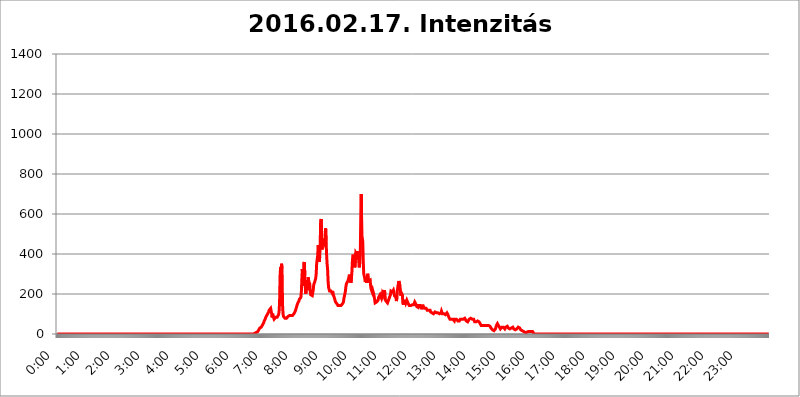
| Category | 2016.02.17. Intenzitás [W/m^2] |
|---|---|
| 0.0 | 0 |
| 0.0006944444444444445 | 0 |
| 0.001388888888888889 | 0 |
| 0.0020833333333333333 | 0 |
| 0.002777777777777778 | 0 |
| 0.003472222222222222 | 0 |
| 0.004166666666666667 | 0 |
| 0.004861111111111111 | 0 |
| 0.005555555555555556 | 0 |
| 0.0062499999999999995 | 0 |
| 0.006944444444444444 | 0 |
| 0.007638888888888889 | 0 |
| 0.008333333333333333 | 0 |
| 0.009027777777777779 | 0 |
| 0.009722222222222222 | 0 |
| 0.010416666666666666 | 0 |
| 0.011111111111111112 | 0 |
| 0.011805555555555555 | 0 |
| 0.012499999999999999 | 0 |
| 0.013194444444444444 | 0 |
| 0.013888888888888888 | 0 |
| 0.014583333333333332 | 0 |
| 0.015277777777777777 | 0 |
| 0.015972222222222224 | 0 |
| 0.016666666666666666 | 0 |
| 0.017361111111111112 | 0 |
| 0.018055555555555557 | 0 |
| 0.01875 | 0 |
| 0.019444444444444445 | 0 |
| 0.02013888888888889 | 0 |
| 0.020833333333333332 | 0 |
| 0.02152777777777778 | 0 |
| 0.022222222222222223 | 0 |
| 0.02291666666666667 | 0 |
| 0.02361111111111111 | 0 |
| 0.024305555555555556 | 0 |
| 0.024999999999999998 | 0 |
| 0.025694444444444447 | 0 |
| 0.02638888888888889 | 0 |
| 0.027083333333333334 | 0 |
| 0.027777777777777776 | 0 |
| 0.02847222222222222 | 0 |
| 0.029166666666666664 | 0 |
| 0.029861111111111113 | 0 |
| 0.030555555555555555 | 0 |
| 0.03125 | 0 |
| 0.03194444444444445 | 0 |
| 0.03263888888888889 | 0 |
| 0.03333333333333333 | 0 |
| 0.034027777777777775 | 0 |
| 0.034722222222222224 | 0 |
| 0.035416666666666666 | 0 |
| 0.036111111111111115 | 0 |
| 0.03680555555555556 | 0 |
| 0.0375 | 0 |
| 0.03819444444444444 | 0 |
| 0.03888888888888889 | 0 |
| 0.03958333333333333 | 0 |
| 0.04027777777777778 | 0 |
| 0.04097222222222222 | 0 |
| 0.041666666666666664 | 0 |
| 0.042361111111111106 | 0 |
| 0.04305555555555556 | 0 |
| 0.043750000000000004 | 0 |
| 0.044444444444444446 | 0 |
| 0.04513888888888889 | 0 |
| 0.04583333333333334 | 0 |
| 0.04652777777777778 | 0 |
| 0.04722222222222222 | 0 |
| 0.04791666666666666 | 0 |
| 0.04861111111111111 | 0 |
| 0.049305555555555554 | 0 |
| 0.049999999999999996 | 0 |
| 0.05069444444444445 | 0 |
| 0.051388888888888894 | 0 |
| 0.052083333333333336 | 0 |
| 0.05277777777777778 | 0 |
| 0.05347222222222222 | 0 |
| 0.05416666666666667 | 0 |
| 0.05486111111111111 | 0 |
| 0.05555555555555555 | 0 |
| 0.05625 | 0 |
| 0.05694444444444444 | 0 |
| 0.057638888888888885 | 0 |
| 0.05833333333333333 | 0 |
| 0.05902777777777778 | 0 |
| 0.059722222222222225 | 0 |
| 0.06041666666666667 | 0 |
| 0.061111111111111116 | 0 |
| 0.06180555555555556 | 0 |
| 0.0625 | 0 |
| 0.06319444444444444 | 0 |
| 0.06388888888888888 | 0 |
| 0.06458333333333334 | 0 |
| 0.06527777777777778 | 0 |
| 0.06597222222222222 | 0 |
| 0.06666666666666667 | 0 |
| 0.06736111111111111 | 0 |
| 0.06805555555555555 | 0 |
| 0.06874999999999999 | 0 |
| 0.06944444444444443 | 0 |
| 0.07013888888888889 | 0 |
| 0.07083333333333333 | 0 |
| 0.07152777777777779 | 0 |
| 0.07222222222222223 | 0 |
| 0.07291666666666667 | 0 |
| 0.07361111111111111 | 0 |
| 0.07430555555555556 | 0 |
| 0.075 | 0 |
| 0.07569444444444444 | 0 |
| 0.0763888888888889 | 0 |
| 0.07708333333333334 | 0 |
| 0.07777777777777778 | 0 |
| 0.07847222222222222 | 0 |
| 0.07916666666666666 | 0 |
| 0.0798611111111111 | 0 |
| 0.08055555555555556 | 0 |
| 0.08125 | 0 |
| 0.08194444444444444 | 0 |
| 0.08263888888888889 | 0 |
| 0.08333333333333333 | 0 |
| 0.08402777777777777 | 0 |
| 0.08472222222222221 | 0 |
| 0.08541666666666665 | 0 |
| 0.08611111111111112 | 0 |
| 0.08680555555555557 | 0 |
| 0.08750000000000001 | 0 |
| 0.08819444444444445 | 0 |
| 0.08888888888888889 | 0 |
| 0.08958333333333333 | 0 |
| 0.09027777777777778 | 0 |
| 0.09097222222222222 | 0 |
| 0.09166666666666667 | 0 |
| 0.09236111111111112 | 0 |
| 0.09305555555555556 | 0 |
| 0.09375 | 0 |
| 0.09444444444444444 | 0 |
| 0.09513888888888888 | 0 |
| 0.09583333333333333 | 0 |
| 0.09652777777777777 | 0 |
| 0.09722222222222222 | 0 |
| 0.09791666666666667 | 0 |
| 0.09861111111111111 | 0 |
| 0.09930555555555555 | 0 |
| 0.09999999999999999 | 0 |
| 0.10069444444444443 | 0 |
| 0.1013888888888889 | 0 |
| 0.10208333333333335 | 0 |
| 0.10277777777777779 | 0 |
| 0.10347222222222223 | 0 |
| 0.10416666666666667 | 0 |
| 0.10486111111111111 | 0 |
| 0.10555555555555556 | 0 |
| 0.10625 | 0 |
| 0.10694444444444444 | 0 |
| 0.1076388888888889 | 0 |
| 0.10833333333333334 | 0 |
| 0.10902777777777778 | 0 |
| 0.10972222222222222 | 0 |
| 0.1111111111111111 | 0 |
| 0.11180555555555556 | 0 |
| 0.11180555555555556 | 0 |
| 0.1125 | 0 |
| 0.11319444444444444 | 0 |
| 0.11388888888888889 | 0 |
| 0.11458333333333333 | 0 |
| 0.11527777777777777 | 0 |
| 0.11597222222222221 | 0 |
| 0.11666666666666665 | 0 |
| 0.1173611111111111 | 0 |
| 0.11805555555555557 | 0 |
| 0.11944444444444445 | 0 |
| 0.12013888888888889 | 0 |
| 0.12083333333333333 | 0 |
| 0.12152777777777778 | 0 |
| 0.12222222222222223 | 0 |
| 0.12291666666666667 | 0 |
| 0.12291666666666667 | 0 |
| 0.12361111111111112 | 0 |
| 0.12430555555555556 | 0 |
| 0.125 | 0 |
| 0.12569444444444444 | 0 |
| 0.12638888888888888 | 0 |
| 0.12708333333333333 | 0 |
| 0.16875 | 0 |
| 0.12847222222222224 | 0 |
| 0.12916666666666668 | 0 |
| 0.12986111111111112 | 0 |
| 0.13055555555555556 | 0 |
| 0.13125 | 0 |
| 0.13194444444444445 | 0 |
| 0.1326388888888889 | 0 |
| 0.13333333333333333 | 0 |
| 0.13402777777777777 | 0 |
| 0.13402777777777777 | 0 |
| 0.13472222222222222 | 0 |
| 0.13541666666666666 | 0 |
| 0.1361111111111111 | 0 |
| 0.13749999999999998 | 0 |
| 0.13819444444444443 | 0 |
| 0.1388888888888889 | 0 |
| 0.13958333333333334 | 0 |
| 0.14027777777777778 | 0 |
| 0.14097222222222222 | 0 |
| 0.14166666666666666 | 0 |
| 0.1423611111111111 | 0 |
| 0.14305555555555557 | 0 |
| 0.14375000000000002 | 0 |
| 0.14444444444444446 | 0 |
| 0.1451388888888889 | 0 |
| 0.1451388888888889 | 0 |
| 0.14652777777777778 | 0 |
| 0.14722222222222223 | 0 |
| 0.14791666666666667 | 0 |
| 0.1486111111111111 | 0 |
| 0.14930555555555555 | 0 |
| 0.15 | 0 |
| 0.15069444444444444 | 0 |
| 0.15138888888888888 | 0 |
| 0.15208333333333332 | 0 |
| 0.15277777777777776 | 0 |
| 0.15347222222222223 | 0 |
| 0.15416666666666667 | 0 |
| 0.15486111111111112 | 0 |
| 0.15555555555555556 | 0 |
| 0.15625 | 0 |
| 0.15694444444444444 | 0 |
| 0.15763888888888888 | 0 |
| 0.15833333333333333 | 0 |
| 0.15902777777777777 | 0 |
| 0.15972222222222224 | 0 |
| 0.16041666666666668 | 0 |
| 0.16111111111111112 | 0 |
| 0.16180555555555556 | 0 |
| 0.1625 | 0 |
| 0.16319444444444445 | 0 |
| 0.1638888888888889 | 0 |
| 0.16458333333333333 | 0 |
| 0.16527777777777777 | 0 |
| 0.16597222222222222 | 0 |
| 0.16666666666666666 | 0 |
| 0.1673611111111111 | 0 |
| 0.16805555555555554 | 0 |
| 0.16874999999999998 | 0 |
| 0.16944444444444443 | 0 |
| 0.17013888888888887 | 0 |
| 0.1708333333333333 | 0 |
| 0.17152777777777775 | 0 |
| 0.17222222222222225 | 0 |
| 0.1729166666666667 | 0 |
| 0.17361111111111113 | 0 |
| 0.17430555555555557 | 0 |
| 0.17500000000000002 | 0 |
| 0.17569444444444446 | 0 |
| 0.1763888888888889 | 0 |
| 0.17708333333333334 | 0 |
| 0.17777777777777778 | 0 |
| 0.17847222222222223 | 0 |
| 0.17916666666666667 | 0 |
| 0.1798611111111111 | 0 |
| 0.18055555555555555 | 0 |
| 0.18125 | 0 |
| 0.18194444444444444 | 0 |
| 0.1826388888888889 | 0 |
| 0.18333333333333335 | 0 |
| 0.1840277777777778 | 0 |
| 0.18472222222222223 | 0 |
| 0.18541666666666667 | 0 |
| 0.18611111111111112 | 0 |
| 0.18680555555555556 | 0 |
| 0.1875 | 0 |
| 0.18819444444444444 | 0 |
| 0.18888888888888888 | 0 |
| 0.18958333333333333 | 0 |
| 0.19027777777777777 | 0 |
| 0.1909722222222222 | 0 |
| 0.19166666666666665 | 0 |
| 0.19236111111111112 | 0 |
| 0.19305555555555554 | 0 |
| 0.19375 | 0 |
| 0.19444444444444445 | 0 |
| 0.1951388888888889 | 0 |
| 0.19583333333333333 | 0 |
| 0.19652777777777777 | 0 |
| 0.19722222222222222 | 0 |
| 0.19791666666666666 | 0 |
| 0.1986111111111111 | 0 |
| 0.19930555555555554 | 0 |
| 0.19999999999999998 | 0 |
| 0.20069444444444443 | 0 |
| 0.20138888888888887 | 0 |
| 0.2020833333333333 | 0 |
| 0.2027777777777778 | 0 |
| 0.2034722222222222 | 0 |
| 0.2041666666666667 | 0 |
| 0.20486111111111113 | 0 |
| 0.20555555555555557 | 0 |
| 0.20625000000000002 | 0 |
| 0.20694444444444446 | 0 |
| 0.2076388888888889 | 0 |
| 0.20833333333333334 | 0 |
| 0.20902777777777778 | 0 |
| 0.20972222222222223 | 0 |
| 0.21041666666666667 | 0 |
| 0.2111111111111111 | 0 |
| 0.21180555555555555 | 0 |
| 0.2125 | 0 |
| 0.21319444444444444 | 0 |
| 0.2138888888888889 | 0 |
| 0.21458333333333335 | 0 |
| 0.2152777777777778 | 0 |
| 0.21597222222222223 | 0 |
| 0.21666666666666667 | 0 |
| 0.21736111111111112 | 0 |
| 0.21805555555555556 | 0 |
| 0.21875 | 0 |
| 0.21944444444444444 | 0 |
| 0.22013888888888888 | 0 |
| 0.22083333333333333 | 0 |
| 0.22152777777777777 | 0 |
| 0.2222222222222222 | 0 |
| 0.22291666666666665 | 0 |
| 0.2236111111111111 | 0 |
| 0.22430555555555556 | 0 |
| 0.225 | 0 |
| 0.22569444444444445 | 0 |
| 0.2263888888888889 | 0 |
| 0.22708333333333333 | 0 |
| 0.22777777777777777 | 0 |
| 0.22847222222222222 | 0 |
| 0.22916666666666666 | 0 |
| 0.2298611111111111 | 0 |
| 0.23055555555555554 | 0 |
| 0.23124999999999998 | 0 |
| 0.23194444444444443 | 0 |
| 0.23263888888888887 | 0 |
| 0.2333333333333333 | 0 |
| 0.2340277777777778 | 0 |
| 0.2347222222222222 | 0 |
| 0.2354166666666667 | 0 |
| 0.23611111111111113 | 0 |
| 0.23680555555555557 | 0 |
| 0.23750000000000002 | 0 |
| 0.23819444444444446 | 0 |
| 0.2388888888888889 | 0 |
| 0.23958333333333334 | 0 |
| 0.24027777777777778 | 0 |
| 0.24097222222222223 | 0 |
| 0.24166666666666667 | 0 |
| 0.2423611111111111 | 0 |
| 0.24305555555555555 | 0 |
| 0.24375 | 0 |
| 0.24444444444444446 | 0 |
| 0.24513888888888888 | 0 |
| 0.24583333333333335 | 0 |
| 0.2465277777777778 | 0 |
| 0.24722222222222223 | 0 |
| 0.24791666666666667 | 0 |
| 0.24861111111111112 | 0 |
| 0.24930555555555556 | 0 |
| 0.25 | 0 |
| 0.25069444444444444 | 0 |
| 0.2513888888888889 | 0 |
| 0.2520833333333333 | 0 |
| 0.25277777777777777 | 0 |
| 0.2534722222222222 | 0 |
| 0.25416666666666665 | 0 |
| 0.2548611111111111 | 0 |
| 0.2555555555555556 | 0 |
| 0.25625000000000003 | 0 |
| 0.2569444444444445 | 0 |
| 0.2576388888888889 | 0 |
| 0.25833333333333336 | 0 |
| 0.2590277777777778 | 0 |
| 0.25972222222222224 | 0 |
| 0.2604166666666667 | 0 |
| 0.2611111111111111 | 0 |
| 0.26180555555555557 | 0 |
| 0.2625 | 0 |
| 0.26319444444444445 | 0 |
| 0.2638888888888889 | 0 |
| 0.26458333333333334 | 0 |
| 0.2652777777777778 | 0 |
| 0.2659722222222222 | 0 |
| 0.26666666666666666 | 0 |
| 0.2673611111111111 | 0 |
| 0.26805555555555555 | 0 |
| 0.26875 | 0 |
| 0.26944444444444443 | 0 |
| 0.2701388888888889 | 0 |
| 0.2708333333333333 | 0 |
| 0.27152777777777776 | 0 |
| 0.2722222222222222 | 0 |
| 0.27291666666666664 | 0 |
| 0.2736111111111111 | 0 |
| 0.2743055555555555 | 0 |
| 0.27499999999999997 | 0 |
| 0.27569444444444446 | 3.525 |
| 0.27638888888888885 | 3.525 |
| 0.27708333333333335 | 3.525 |
| 0.2777777777777778 | 3.525 |
| 0.27847222222222223 | 7.887 |
| 0.2791666666666667 | 7.887 |
| 0.2798611111111111 | 12.257 |
| 0.28055555555555556 | 12.257 |
| 0.28125 | 12.257 |
| 0.28194444444444444 | 16.636 |
| 0.2826388888888889 | 21.024 |
| 0.2833333333333333 | 25.419 |
| 0.28402777777777777 | 29.823 |
| 0.2847222222222222 | 29.823 |
| 0.28541666666666665 | 34.234 |
| 0.28611111111111115 | 34.234 |
| 0.28680555555555554 | 38.653 |
| 0.28750000000000003 | 43.079 |
| 0.2881944444444445 | 47.511 |
| 0.2888888888888889 | 47.511 |
| 0.28958333333333336 | 56.398 |
| 0.2902777777777778 | 65.31 |
| 0.29097222222222224 | 69.775 |
| 0.2916666666666667 | 74.246 |
| 0.2923611111111111 | 83.205 |
| 0.29305555555555557 | 83.205 |
| 0.29375 | 92.184 |
| 0.29444444444444445 | 92.184 |
| 0.2951388888888889 | 101.184 |
| 0.29583333333333334 | 101.184 |
| 0.2965277777777778 | 110.201 |
| 0.2972222222222222 | 119.235 |
| 0.29791666666666666 | 123.758 |
| 0.2986111111111111 | 123.758 |
| 0.29930555555555555 | 128.284 |
| 0.3 | 123.758 |
| 0.30069444444444443 | 101.184 |
| 0.3013888888888889 | 83.205 |
| 0.3020833333333333 | 101.184 |
| 0.30277777777777776 | 87.692 |
| 0.3034722222222222 | 83.205 |
| 0.30416666666666664 | 74.246 |
| 0.3048611111111111 | 78.722 |
| 0.3055555555555555 | 78.722 |
| 0.30624999999999997 | 83.205 |
| 0.3069444444444444 | 83.205 |
| 0.3076388888888889 | 83.205 |
| 0.30833333333333335 | 83.205 |
| 0.3090277777777778 | 83.205 |
| 0.30972222222222223 | 87.692 |
| 0.3104166666666667 | 96.682 |
| 0.3111111111111111 | 110.201 |
| 0.31180555555555556 | 155.509 |
| 0.3125 | 287.709 |
| 0.31319444444444444 | 333.113 |
| 0.3138888888888889 | 310.44 |
| 0.3145833333333333 | 351.198 |
| 0.31527777777777777 | 328.584 |
| 0.3159722222222222 | 146.423 |
| 0.31666666666666665 | 101.184 |
| 0.31736111111111115 | 87.692 |
| 0.31805555555555554 | 83.205 |
| 0.31875000000000003 | 83.205 |
| 0.3194444444444445 | 78.722 |
| 0.3201388888888889 | 78.722 |
| 0.32083333333333336 | 78.722 |
| 0.3215277777777778 | 78.722 |
| 0.32222222222222224 | 78.722 |
| 0.3229166666666667 | 83.205 |
| 0.3236111111111111 | 87.692 |
| 0.32430555555555557 | 87.692 |
| 0.325 | 92.184 |
| 0.32569444444444445 | 92.184 |
| 0.3263888888888889 | 92.184 |
| 0.32708333333333334 | 92.184 |
| 0.3277777777777778 | 92.184 |
| 0.3284722222222222 | 92.184 |
| 0.32916666666666666 | 87.692 |
| 0.3298611111111111 | 92.184 |
| 0.33055555555555555 | 92.184 |
| 0.33125 | 92.184 |
| 0.33194444444444443 | 101.184 |
| 0.3326388888888889 | 105.69 |
| 0.3333333333333333 | 110.201 |
| 0.3340277777777778 | 114.716 |
| 0.3347222222222222 | 123.758 |
| 0.3354166666666667 | 132.814 |
| 0.3361111111111111 | 141.884 |
| 0.3368055555555556 | 146.423 |
| 0.33749999999999997 | 155.509 |
| 0.33819444444444446 | 160.056 |
| 0.33888888888888885 | 164.605 |
| 0.33958333333333335 | 173.709 |
| 0.34027777777777773 | 173.709 |
| 0.34097222222222223 | 173.709 |
| 0.3416666666666666 | 182.82 |
| 0.3423611111111111 | 210.182 |
| 0.3430555555555555 | 274.047 |
| 0.34375 | 324.052 |
| 0.3444444444444445 | 242.127 |
| 0.3451388888888889 | 269.49 |
| 0.3458333333333334 | 351.198 |
| 0.34652777777777777 | 360.221 |
| 0.34722222222222227 | 292.259 |
| 0.34791666666666665 | 233 |
| 0.34861111111111115 | 201.058 |
| 0.34930555555555554 | 201.058 |
| 0.35000000000000003 | 269.49 |
| 0.3506944444444444 | 219.309 |
| 0.3513888888888889 | 228.436 |
| 0.3520833333333333 | 283.156 |
| 0.3527777777777778 | 260.373 |
| 0.3534722222222222 | 255.813 |
| 0.3541666666666667 | 251.251 |
| 0.3548611111111111 | 210.182 |
| 0.35555555555555557 | 196.497 |
| 0.35625 | 201.058 |
| 0.35694444444444445 | 191.937 |
| 0.3576388888888889 | 191.937 |
| 0.35833333333333334 | 196.497 |
| 0.3590277777777778 | 219.309 |
| 0.3597222222222222 | 246.689 |
| 0.36041666666666666 | 246.689 |
| 0.3611111111111111 | 260.373 |
| 0.36180555555555555 | 264.932 |
| 0.3625 | 278.603 |
| 0.36319444444444443 | 301.354 |
| 0.3638888888888889 | 355.712 |
| 0.3645833333333333 | 373.729 |
| 0.3652777777777778 | 391.685 |
| 0.3659722222222222 | 445.129 |
| 0.3666666666666667 | 431.833 |
| 0.3673611111111111 | 360.221 |
| 0.3680555555555556 | 382.715 |
| 0.36874999999999997 | 440.702 |
| 0.36944444444444446 | 562.53 |
| 0.37013888888888885 | 575.299 |
| 0.37083333333333335 | 510.885 |
| 0.37152777777777773 | 422.943 |
| 0.37222222222222223 | 475.972 |
| 0.3729166666666666 | 467.187 |
| 0.3736111111111111 | 462.786 |
| 0.3743055555555555 | 453.968 |
| 0.375 | 458.38 |
| 0.3756944444444445 | 471.582 |
| 0.3763888888888889 | 528.2 |
| 0.3770833333333334 | 462.786 |
| 0.37777777777777777 | 396.164 |
| 0.37847222222222227 | 351.198 |
| 0.37916666666666665 | 324.052 |
| 0.37986111111111115 | 264.932 |
| 0.38055555555555554 | 233 |
| 0.38125000000000003 | 223.873 |
| 0.3819444444444444 | 214.746 |
| 0.3826388888888889 | 219.309 |
| 0.3833333333333333 | 210.182 |
| 0.3840277777777778 | 214.746 |
| 0.3847222222222222 | 210.182 |
| 0.3854166666666667 | 205.62 |
| 0.3861111111111111 | 214.746 |
| 0.38680555555555557 | 201.058 |
| 0.3875 | 201.058 |
| 0.38819444444444445 | 196.497 |
| 0.3888888888888889 | 178.264 |
| 0.38958333333333334 | 169.156 |
| 0.3902777777777778 | 160.056 |
| 0.3909722222222222 | 160.056 |
| 0.39166666666666666 | 155.509 |
| 0.3923611111111111 | 150.964 |
| 0.39305555555555555 | 150.964 |
| 0.39375 | 141.884 |
| 0.39444444444444443 | 146.423 |
| 0.3951388888888889 | 141.884 |
| 0.3958333333333333 | 141.884 |
| 0.3965277777777778 | 141.884 |
| 0.3972222222222222 | 141.884 |
| 0.3979166666666667 | 141.884 |
| 0.3986111111111111 | 137.347 |
| 0.3993055555555556 | 141.884 |
| 0.39999999999999997 | 150.964 |
| 0.40069444444444446 | 155.509 |
| 0.40138888888888885 | 160.056 |
| 0.40208333333333335 | 178.264 |
| 0.40277777777777773 | 182.82 |
| 0.40347222222222223 | 201.058 |
| 0.4041666666666666 | 214.746 |
| 0.4048611111111111 | 237.564 |
| 0.4055555555555555 | 251.251 |
| 0.40625 | 251.251 |
| 0.4069444444444445 | 255.813 |
| 0.4076388888888889 | 264.932 |
| 0.4083333333333334 | 269.49 |
| 0.40902777777777777 | 283.156 |
| 0.40972222222222227 | 296.808 |
| 0.41041666666666665 | 283.156 |
| 0.41111111111111115 | 274.047 |
| 0.41180555555555554 | 255.813 |
| 0.41250000000000003 | 274.047 |
| 0.4131944444444444 | 305.898 |
| 0.4138888888888889 | 360.221 |
| 0.4145833333333333 | 391.685 |
| 0.4152777777777778 | 396.164 |
| 0.4159722222222222 | 387.202 |
| 0.4166666666666667 | 391.685 |
| 0.4173611111111111 | 333.113 |
| 0.41805555555555557 | 333.113 |
| 0.41875 | 405.108 |
| 0.41944444444444445 | 400.638 |
| 0.4201388888888889 | 400.638 |
| 0.42083333333333334 | 391.685 |
| 0.4215277777777778 | 414.035 |
| 0.4222222222222222 | 396.164 |
| 0.42291666666666666 | 360.221 |
| 0.4236111111111111 | 333.113 |
| 0.42430555555555555 | 360.221 |
| 0.425 | 391.685 |
| 0.42569444444444443 | 588.009 |
| 0.4263888888888889 | 699.717 |
| 0.4270833333333333 | 497.836 |
| 0.4277777777777778 | 493.475 |
| 0.4284722222222222 | 462.786 |
| 0.4291666666666667 | 364.728 |
| 0.4298611111111111 | 301.354 |
| 0.4305555555555556 | 305.898 |
| 0.43124999999999997 | 278.603 |
| 0.43194444444444446 | 260.373 |
| 0.43263888888888885 | 264.932 |
| 0.43333333333333335 | 274.047 |
| 0.43402777777777773 | 255.813 |
| 0.43472222222222223 | 274.047 |
| 0.4354166666666666 | 301.354 |
| 0.4361111111111111 | 274.047 |
| 0.4368055555555555 | 264.932 |
| 0.4375 | 260.373 |
| 0.4381944444444445 | 264.932 |
| 0.4388888888888889 | 269.49 |
| 0.4395833333333334 | 237.564 |
| 0.44027777777777777 | 223.873 |
| 0.44097222222222227 | 219.309 |
| 0.44166666666666665 | 210.182 |
| 0.44236111111111115 | 219.309 |
| 0.44305555555555554 | 210.182 |
| 0.44375000000000003 | 201.058 |
| 0.4444444444444444 | 187.378 |
| 0.4451388888888889 | 173.709 |
| 0.4458333333333333 | 155.509 |
| 0.4465277777777778 | 150.964 |
| 0.4472222222222222 | 150.964 |
| 0.4479166666666667 | 160.056 |
| 0.4486111111111111 | 164.605 |
| 0.44930555555555557 | 164.605 |
| 0.45 | 169.156 |
| 0.45069444444444445 | 182.82 |
| 0.4513888888888889 | 187.378 |
| 0.45208333333333334 | 187.378 |
| 0.4527777777777778 | 196.497 |
| 0.4534722222222222 | 196.497 |
| 0.45416666666666666 | 196.497 |
| 0.4548611111111111 | 178.264 |
| 0.45555555555555555 | 187.378 |
| 0.45625 | 205.62 |
| 0.45694444444444443 | 205.62 |
| 0.4576388888888889 | 196.497 |
| 0.4583333333333333 | 210.182 |
| 0.4590277777777778 | 219.309 |
| 0.4597222222222222 | 173.709 |
| 0.4604166666666667 | 169.156 |
| 0.4611111111111111 | 164.605 |
| 0.4618055555555556 | 164.605 |
| 0.46249999999999997 | 160.056 |
| 0.46319444444444446 | 155.509 |
| 0.46388888888888885 | 155.509 |
| 0.46458333333333335 | 169.156 |
| 0.46527777777777773 | 173.709 |
| 0.46597222222222223 | 182.82 |
| 0.4666666666666666 | 182.82 |
| 0.4673611111111111 | 196.497 |
| 0.4680555555555555 | 214.746 |
| 0.46875 | 214.746 |
| 0.4694444444444445 | 214.746 |
| 0.4701388888888889 | 210.182 |
| 0.4708333333333334 | 214.746 |
| 0.47152777777777777 | 219.309 |
| 0.47222222222222227 | 210.182 |
| 0.47291666666666665 | 191.937 |
| 0.47361111111111115 | 196.497 |
| 0.47430555555555554 | 196.497 |
| 0.47500000000000003 | 182.82 |
| 0.4756944444444444 | 164.605 |
| 0.4763888888888889 | 182.82 |
| 0.4770833333333333 | 219.309 |
| 0.4777777777777778 | 237.564 |
| 0.4784722222222222 | 251.251 |
| 0.4791666666666667 | 264.932 |
| 0.4798611111111111 | 264.932 |
| 0.48055555555555557 | 242.127 |
| 0.48125 | 219.309 |
| 0.48194444444444445 | 191.937 |
| 0.4826388888888889 | 205.62 |
| 0.48333333333333334 | 205.62 |
| 0.4840277777777778 | 196.497 |
| 0.4847222222222222 | 155.509 |
| 0.48541666666666666 | 146.423 |
| 0.4861111111111111 | 164.605 |
| 0.48680555555555555 | 160.056 |
| 0.4875 | 164.605 |
| 0.48819444444444443 | 164.605 |
| 0.4888888888888889 | 155.509 |
| 0.4895833333333333 | 160.056 |
| 0.4902777777777778 | 169.156 |
| 0.4909722222222222 | 173.709 |
| 0.4916666666666667 | 169.156 |
| 0.4923611111111111 | 150.964 |
| 0.4930555555555556 | 146.423 |
| 0.49374999999999997 | 141.884 |
| 0.49444444444444446 | 141.884 |
| 0.49513888888888885 | 141.884 |
| 0.49583333333333335 | 141.884 |
| 0.49652777777777773 | 141.884 |
| 0.49722222222222223 | 146.423 |
| 0.4979166666666666 | 146.423 |
| 0.4986111111111111 | 150.964 |
| 0.4993055555555555 | 150.964 |
| 0.5 | 146.423 |
| 0.5006944444444444 | 150.964 |
| 0.5013888888888889 | 160.056 |
| 0.5020833333333333 | 160.056 |
| 0.5027777777777778 | 150.964 |
| 0.5034722222222222 | 146.423 |
| 0.5041666666666667 | 137.347 |
| 0.5048611111111111 | 141.884 |
| 0.5055555555555555 | 141.884 |
| 0.50625 | 132.814 |
| 0.5069444444444444 | 141.884 |
| 0.5076388888888889 | 137.347 |
| 0.5083333333333333 | 137.347 |
| 0.5090277777777777 | 141.884 |
| 0.5097222222222222 | 141.884 |
| 0.5104166666666666 | 132.814 |
| 0.5111111111111112 | 123.758 |
| 0.5118055555555555 | 128.284 |
| 0.5125000000000001 | 146.423 |
| 0.5131944444444444 | 137.347 |
| 0.513888888888889 | 137.347 |
| 0.5145833333333333 | 132.814 |
| 0.5152777777777778 | 128.284 |
| 0.5159722222222222 | 132.814 |
| 0.5166666666666667 | 123.758 |
| 0.517361111111111 | 128.284 |
| 0.5180555555555556 | 123.758 |
| 0.5187499999999999 | 119.235 |
| 0.5194444444444445 | 119.235 |
| 0.5201388888888888 | 119.235 |
| 0.5208333333333334 | 119.235 |
| 0.5215277777777778 | 119.235 |
| 0.5222222222222223 | 119.235 |
| 0.5229166666666667 | 119.235 |
| 0.5236111111111111 | 110.201 |
| 0.5243055555555556 | 110.201 |
| 0.525 | 105.69 |
| 0.5256944444444445 | 105.69 |
| 0.5263888888888889 | 105.69 |
| 0.5270833333333333 | 105.69 |
| 0.5277777777777778 | 101.184 |
| 0.5284722222222222 | 105.69 |
| 0.5291666666666667 | 105.69 |
| 0.5298611111111111 | 110.201 |
| 0.5305555555555556 | 110.201 |
| 0.53125 | 110.201 |
| 0.5319444444444444 | 105.69 |
| 0.5326388888888889 | 105.69 |
| 0.5333333333333333 | 105.69 |
| 0.5340277777777778 | 105.69 |
| 0.5347222222222222 | 101.184 |
| 0.5354166666666667 | 101.184 |
| 0.5361111111111111 | 101.184 |
| 0.5368055555555555 | 105.69 |
| 0.5375 | 101.184 |
| 0.5381944444444444 | 105.69 |
| 0.5388888888888889 | 114.716 |
| 0.5395833333333333 | 114.716 |
| 0.5402777777777777 | 101.184 |
| 0.5409722222222222 | 105.69 |
| 0.5416666666666666 | 105.69 |
| 0.5423611111111112 | 101.184 |
| 0.5430555555555555 | 96.682 |
| 0.5437500000000001 | 96.682 |
| 0.5444444444444444 | 96.682 |
| 0.545138888888889 | 101.184 |
| 0.5458333333333333 | 101.184 |
| 0.5465277777777778 | 105.69 |
| 0.5472222222222222 | 101.184 |
| 0.5479166666666667 | 96.682 |
| 0.548611111111111 | 92.184 |
| 0.5493055555555556 | 83.205 |
| 0.5499999999999999 | 78.722 |
| 0.5506944444444445 | 74.246 |
| 0.5513888888888888 | 74.246 |
| 0.5520833333333334 | 78.722 |
| 0.5527777777777778 | 74.246 |
| 0.5534722222222223 | 78.722 |
| 0.5541666666666667 | 74.246 |
| 0.5548611111111111 | 74.246 |
| 0.5555555555555556 | 74.246 |
| 0.55625 | 78.722 |
| 0.5569444444444445 | 65.31 |
| 0.5576388888888889 | 74.246 |
| 0.5583333333333333 | 74.246 |
| 0.5590277777777778 | 74.246 |
| 0.5597222222222222 | 74.246 |
| 0.5604166666666667 | 74.246 |
| 0.5611111111111111 | 69.775 |
| 0.5618055555555556 | 65.31 |
| 0.5625 | 65.31 |
| 0.5631944444444444 | 65.31 |
| 0.5638888888888889 | 65.31 |
| 0.5645833333333333 | 69.775 |
| 0.5652777777777778 | 74.246 |
| 0.5659722222222222 | 78.722 |
| 0.5666666666666667 | 74.246 |
| 0.5673611111111111 | 74.246 |
| 0.5680555555555555 | 74.246 |
| 0.56875 | 78.722 |
| 0.5694444444444444 | 74.246 |
| 0.5701388888888889 | 74.246 |
| 0.5708333333333333 | 78.722 |
| 0.5715277777777777 | 78.722 |
| 0.5722222222222222 | 74.246 |
| 0.5729166666666666 | 74.246 |
| 0.5736111111111112 | 65.31 |
| 0.5743055555555555 | 60.85 |
| 0.5750000000000001 | 65.31 |
| 0.5756944444444444 | 60.85 |
| 0.576388888888889 | 60.85 |
| 0.5770833333333333 | 65.31 |
| 0.5777777777777778 | 74.246 |
| 0.5784722222222222 | 78.722 |
| 0.5791666666666667 | 78.722 |
| 0.579861111111111 | 78.722 |
| 0.5805555555555556 | 74.246 |
| 0.5812499999999999 | 74.246 |
| 0.5819444444444445 | 74.246 |
| 0.5826388888888888 | 74.246 |
| 0.5833333333333334 | 74.246 |
| 0.5840277777777778 | 74.246 |
| 0.5847222222222223 | 69.775 |
| 0.5854166666666667 | 60.85 |
| 0.5861111111111111 | 56.398 |
| 0.5868055555555556 | 60.85 |
| 0.5875 | 60.85 |
| 0.5881944444444445 | 60.85 |
| 0.5888888888888889 | 60.85 |
| 0.5895833333333333 | 65.31 |
| 0.5902777777777778 | 65.31 |
| 0.5909722222222222 | 65.31 |
| 0.5916666666666667 | 60.85 |
| 0.5923611111111111 | 56.398 |
| 0.5930555555555556 | 51.951 |
| 0.59375 | 47.511 |
| 0.5944444444444444 | 43.079 |
| 0.5951388888888889 | 43.079 |
| 0.5958333333333333 | 43.079 |
| 0.5965277777777778 | 43.079 |
| 0.5972222222222222 | 38.653 |
| 0.5979166666666667 | 43.079 |
| 0.5986111111111111 | 43.079 |
| 0.5993055555555555 | 43.079 |
| 0.6 | 43.079 |
| 0.6006944444444444 | 43.079 |
| 0.6013888888888889 | 43.079 |
| 0.6020833333333333 | 47.511 |
| 0.6027777777777777 | 43.079 |
| 0.6034722222222222 | 43.079 |
| 0.6041666666666666 | 43.079 |
| 0.6048611111111112 | 43.079 |
| 0.6055555555555555 | 38.653 |
| 0.6062500000000001 | 38.653 |
| 0.6069444444444444 | 38.653 |
| 0.607638888888889 | 38.653 |
| 0.6083333333333333 | 29.823 |
| 0.6090277777777778 | 29.823 |
| 0.6097222222222222 | 29.823 |
| 0.6104166666666667 | 21.024 |
| 0.611111111111111 | 21.024 |
| 0.6118055555555556 | 16.636 |
| 0.6124999999999999 | 16.636 |
| 0.6131944444444445 | 16.636 |
| 0.6138888888888888 | 21.024 |
| 0.6145833333333334 | 25.419 |
| 0.6152777777777778 | 34.234 |
| 0.6159722222222223 | 43.079 |
| 0.6166666666666667 | 47.511 |
| 0.6173611111111111 | 51.951 |
| 0.6180555555555556 | 51.951 |
| 0.61875 | 43.079 |
| 0.6194444444444445 | 38.653 |
| 0.6201388888888889 | 34.234 |
| 0.6208333333333333 | 29.823 |
| 0.6215277777777778 | 25.419 |
| 0.6222222222222222 | 29.823 |
| 0.6229166666666667 | 29.823 |
| 0.6236111111111111 | 34.234 |
| 0.6243055555555556 | 38.653 |
| 0.625 | 38.653 |
| 0.6256944444444444 | 34.234 |
| 0.6263888888888889 | 29.823 |
| 0.6270833333333333 | 29.823 |
| 0.6277777777777778 | 25.419 |
| 0.6284722222222222 | 29.823 |
| 0.6291666666666667 | 34.234 |
| 0.6298611111111111 | 38.653 |
| 0.6305555555555555 | 38.653 |
| 0.63125 | 38.653 |
| 0.6319444444444444 | 34.234 |
| 0.6326388888888889 | 29.823 |
| 0.6333333333333333 | 29.823 |
| 0.6340277777777777 | 25.419 |
| 0.6347222222222222 | 25.419 |
| 0.6354166666666666 | 25.419 |
| 0.6361111111111112 | 25.419 |
| 0.6368055555555555 | 29.823 |
| 0.6375000000000001 | 29.823 |
| 0.6381944444444444 | 34.234 |
| 0.638888888888889 | 34.234 |
| 0.6395833333333333 | 29.823 |
| 0.6402777777777778 | 25.419 |
| 0.6409722222222222 | 21.024 |
| 0.6416666666666667 | 21.024 |
| 0.642361111111111 | 21.024 |
| 0.6430555555555556 | 21.024 |
| 0.6437499999999999 | 25.419 |
| 0.6444444444444445 | 25.419 |
| 0.6451388888888888 | 25.419 |
| 0.6458333333333334 | 29.823 |
| 0.6465277777777778 | 34.234 |
| 0.6472222222222223 | 34.234 |
| 0.6479166666666667 | 29.823 |
| 0.6486111111111111 | 29.823 |
| 0.6493055555555556 | 25.419 |
| 0.65 | 21.024 |
| 0.6506944444444445 | 21.024 |
| 0.6513888888888889 | 21.024 |
| 0.6520833333333333 | 16.636 |
| 0.6527777777777778 | 12.257 |
| 0.6534722222222222 | 12.257 |
| 0.6541666666666667 | 12.257 |
| 0.6548611111111111 | 7.887 |
| 0.6555555555555556 | 7.887 |
| 0.65625 | 7.887 |
| 0.6569444444444444 | 7.887 |
| 0.6576388888888889 | 7.887 |
| 0.6583333333333333 | 7.887 |
| 0.6590277777777778 | 7.887 |
| 0.6597222222222222 | 7.887 |
| 0.6604166666666667 | 12.257 |
| 0.6611111111111111 | 12.257 |
| 0.6618055555555555 | 12.257 |
| 0.6625 | 12.257 |
| 0.6631944444444444 | 12.257 |
| 0.6638888888888889 | 12.257 |
| 0.6645833333333333 | 12.257 |
| 0.6652777777777777 | 12.257 |
| 0.6659722222222222 | 12.257 |
| 0.6666666666666666 | 12.257 |
| 0.6673611111111111 | 7.887 |
| 0.6680555555555556 | 7.887 |
| 0.6687500000000001 | 0 |
| 0.6694444444444444 | 0 |
| 0.6701388888888888 | 0 |
| 0.6708333333333334 | 0 |
| 0.6715277777777778 | 0 |
| 0.6722222222222222 | 0 |
| 0.6729166666666666 | 0 |
| 0.6736111111111112 | 0 |
| 0.6743055555555556 | 0 |
| 0.6749999999999999 | 0 |
| 0.6756944444444444 | 0 |
| 0.6763888888888889 | 0 |
| 0.6770833333333334 | 0 |
| 0.6777777777777777 | 0 |
| 0.6784722222222223 | 0 |
| 0.6791666666666667 | 0 |
| 0.6798611111111111 | 0 |
| 0.6805555555555555 | 0 |
| 0.68125 | 0 |
| 0.6819444444444445 | 0 |
| 0.6826388888888889 | 0 |
| 0.6833333333333332 | 0 |
| 0.6840277777777778 | 0 |
| 0.6847222222222222 | 0 |
| 0.6854166666666667 | 0 |
| 0.686111111111111 | 0 |
| 0.6868055555555556 | 0 |
| 0.6875 | 0 |
| 0.6881944444444444 | 0 |
| 0.688888888888889 | 0 |
| 0.6895833333333333 | 0 |
| 0.6902777777777778 | 0 |
| 0.6909722222222222 | 0 |
| 0.6916666666666668 | 0 |
| 0.6923611111111111 | 0 |
| 0.6930555555555555 | 0 |
| 0.69375 | 0 |
| 0.6944444444444445 | 0 |
| 0.6951388888888889 | 0 |
| 0.6958333333333333 | 0 |
| 0.6965277777777777 | 0 |
| 0.6972222222222223 | 0 |
| 0.6979166666666666 | 0 |
| 0.6986111111111111 | 0 |
| 0.6993055555555556 | 0 |
| 0.7000000000000001 | 0 |
| 0.7006944444444444 | 0 |
| 0.7013888888888888 | 0 |
| 0.7020833333333334 | 0 |
| 0.7027777777777778 | 0 |
| 0.7034722222222222 | 0 |
| 0.7041666666666666 | 0 |
| 0.7048611111111112 | 0 |
| 0.7055555555555556 | 0 |
| 0.7062499999999999 | 0 |
| 0.7069444444444444 | 0 |
| 0.7076388888888889 | 0 |
| 0.7083333333333334 | 0 |
| 0.7090277777777777 | 0 |
| 0.7097222222222223 | 0 |
| 0.7104166666666667 | 0 |
| 0.7111111111111111 | 0 |
| 0.7118055555555555 | 0 |
| 0.7125 | 0 |
| 0.7131944444444445 | 0 |
| 0.7138888888888889 | 0 |
| 0.7145833333333332 | 0 |
| 0.7152777777777778 | 0 |
| 0.7159722222222222 | 0 |
| 0.7166666666666667 | 0 |
| 0.717361111111111 | 0 |
| 0.7180555555555556 | 0 |
| 0.71875 | 0 |
| 0.7194444444444444 | 0 |
| 0.720138888888889 | 0 |
| 0.7208333333333333 | 0 |
| 0.7215277777777778 | 0 |
| 0.7222222222222222 | 0 |
| 0.7229166666666668 | 0 |
| 0.7236111111111111 | 0 |
| 0.7243055555555555 | 0 |
| 0.725 | 0 |
| 0.7256944444444445 | 0 |
| 0.7263888888888889 | 0 |
| 0.7270833333333333 | 0 |
| 0.7277777777777777 | 0 |
| 0.7284722222222223 | 0 |
| 0.7291666666666666 | 0 |
| 0.7298611111111111 | 0 |
| 0.7305555555555556 | 0 |
| 0.7312500000000001 | 0 |
| 0.7319444444444444 | 0 |
| 0.7326388888888888 | 0 |
| 0.7333333333333334 | 0 |
| 0.7340277777777778 | 0 |
| 0.7347222222222222 | 0 |
| 0.7354166666666666 | 0 |
| 0.7361111111111112 | 0 |
| 0.7368055555555556 | 0 |
| 0.7374999999999999 | 0 |
| 0.7381944444444444 | 0 |
| 0.7388888888888889 | 0 |
| 0.7395833333333334 | 0 |
| 0.7402777777777777 | 0 |
| 0.7409722222222223 | 0 |
| 0.7416666666666667 | 0 |
| 0.7423611111111111 | 0 |
| 0.7430555555555555 | 0 |
| 0.74375 | 0 |
| 0.7444444444444445 | 0 |
| 0.7451388888888889 | 0 |
| 0.7458333333333332 | 0 |
| 0.7465277777777778 | 0 |
| 0.7472222222222222 | 0 |
| 0.7479166666666667 | 0 |
| 0.748611111111111 | 0 |
| 0.7493055555555556 | 0 |
| 0.75 | 0 |
| 0.7506944444444444 | 0 |
| 0.751388888888889 | 0 |
| 0.7520833333333333 | 0 |
| 0.7527777777777778 | 0 |
| 0.7534722222222222 | 0 |
| 0.7541666666666668 | 0 |
| 0.7548611111111111 | 0 |
| 0.7555555555555555 | 0 |
| 0.75625 | 0 |
| 0.7569444444444445 | 0 |
| 0.7576388888888889 | 0 |
| 0.7583333333333333 | 0 |
| 0.7590277777777777 | 0 |
| 0.7597222222222223 | 0 |
| 0.7604166666666666 | 0 |
| 0.7611111111111111 | 0 |
| 0.7618055555555556 | 0 |
| 0.7625000000000001 | 0 |
| 0.7631944444444444 | 0 |
| 0.7638888888888888 | 0 |
| 0.7645833333333334 | 0 |
| 0.7652777777777778 | 0 |
| 0.7659722222222222 | 0 |
| 0.7666666666666666 | 0 |
| 0.7673611111111112 | 0 |
| 0.7680555555555556 | 0 |
| 0.7687499999999999 | 0 |
| 0.7694444444444444 | 0 |
| 0.7701388888888889 | 0 |
| 0.7708333333333334 | 0 |
| 0.7715277777777777 | 0 |
| 0.7722222222222223 | 0 |
| 0.7729166666666667 | 0 |
| 0.7736111111111111 | 0 |
| 0.7743055555555555 | 0 |
| 0.775 | 0 |
| 0.7756944444444445 | 0 |
| 0.7763888888888889 | 0 |
| 0.7770833333333332 | 0 |
| 0.7777777777777778 | 0 |
| 0.7784722222222222 | 0 |
| 0.7791666666666667 | 0 |
| 0.779861111111111 | 0 |
| 0.7805555555555556 | 0 |
| 0.78125 | 0 |
| 0.7819444444444444 | 0 |
| 0.782638888888889 | 0 |
| 0.7833333333333333 | 0 |
| 0.7840277777777778 | 0 |
| 0.7847222222222222 | 0 |
| 0.7854166666666668 | 0 |
| 0.7861111111111111 | 0 |
| 0.7868055555555555 | 0 |
| 0.7875 | 0 |
| 0.7881944444444445 | 0 |
| 0.7888888888888889 | 0 |
| 0.7895833333333333 | 0 |
| 0.7902777777777777 | 0 |
| 0.7909722222222223 | 0 |
| 0.7916666666666666 | 0 |
| 0.7923611111111111 | 0 |
| 0.7930555555555556 | 0 |
| 0.7937500000000001 | 0 |
| 0.7944444444444444 | 0 |
| 0.7951388888888888 | 0 |
| 0.7958333333333334 | 0 |
| 0.7965277777777778 | 0 |
| 0.7972222222222222 | 0 |
| 0.7979166666666666 | 0 |
| 0.7986111111111112 | 0 |
| 0.7993055555555556 | 0 |
| 0.7999999999999999 | 0 |
| 0.8006944444444444 | 0 |
| 0.8013888888888889 | 0 |
| 0.8020833333333334 | 0 |
| 0.8027777777777777 | 0 |
| 0.8034722222222223 | 0 |
| 0.8041666666666667 | 0 |
| 0.8048611111111111 | 0 |
| 0.8055555555555555 | 0 |
| 0.80625 | 0 |
| 0.8069444444444445 | 0 |
| 0.8076388888888889 | 0 |
| 0.8083333333333332 | 0 |
| 0.8090277777777778 | 0 |
| 0.8097222222222222 | 0 |
| 0.8104166666666667 | 0 |
| 0.811111111111111 | 0 |
| 0.8118055555555556 | 0 |
| 0.8125 | 0 |
| 0.8131944444444444 | 0 |
| 0.813888888888889 | 0 |
| 0.8145833333333333 | 0 |
| 0.8152777777777778 | 0 |
| 0.8159722222222222 | 0 |
| 0.8166666666666668 | 0 |
| 0.8173611111111111 | 0 |
| 0.8180555555555555 | 0 |
| 0.81875 | 0 |
| 0.8194444444444445 | 0 |
| 0.8201388888888889 | 0 |
| 0.8208333333333333 | 0 |
| 0.8215277777777777 | 0 |
| 0.8222222222222223 | 0 |
| 0.8229166666666666 | 0 |
| 0.8236111111111111 | 0 |
| 0.8243055555555556 | 0 |
| 0.8250000000000001 | 0 |
| 0.8256944444444444 | 0 |
| 0.8263888888888888 | 0 |
| 0.8270833333333334 | 0 |
| 0.8277777777777778 | 0 |
| 0.8284722222222222 | 0 |
| 0.8291666666666666 | 0 |
| 0.8298611111111112 | 0 |
| 0.8305555555555556 | 0 |
| 0.8312499999999999 | 0 |
| 0.8319444444444444 | 0 |
| 0.8326388888888889 | 0 |
| 0.8333333333333334 | 0 |
| 0.8340277777777777 | 0 |
| 0.8347222222222223 | 0 |
| 0.8354166666666667 | 0 |
| 0.8361111111111111 | 0 |
| 0.8368055555555555 | 0 |
| 0.8375 | 0 |
| 0.8381944444444445 | 0 |
| 0.8388888888888889 | 0 |
| 0.8395833333333332 | 0 |
| 0.8402777777777778 | 0 |
| 0.8409722222222222 | 0 |
| 0.8416666666666667 | 0 |
| 0.842361111111111 | 0 |
| 0.8430555555555556 | 0 |
| 0.84375 | 0 |
| 0.8444444444444444 | 0 |
| 0.845138888888889 | 0 |
| 0.8458333333333333 | 0 |
| 0.8465277777777778 | 0 |
| 0.8472222222222222 | 0 |
| 0.8479166666666668 | 0 |
| 0.8486111111111111 | 0 |
| 0.8493055555555555 | 0 |
| 0.85 | 0 |
| 0.8506944444444445 | 0 |
| 0.8513888888888889 | 0 |
| 0.8520833333333333 | 0 |
| 0.8527777777777777 | 0 |
| 0.8534722222222223 | 0 |
| 0.8541666666666666 | 0 |
| 0.8548611111111111 | 0 |
| 0.8555555555555556 | 0 |
| 0.8562500000000001 | 0 |
| 0.8569444444444444 | 0 |
| 0.8576388888888888 | 0 |
| 0.8583333333333334 | 0 |
| 0.8590277777777778 | 0 |
| 0.8597222222222222 | 0 |
| 0.8604166666666666 | 0 |
| 0.8611111111111112 | 0 |
| 0.8618055555555556 | 0 |
| 0.8624999999999999 | 0 |
| 0.8631944444444444 | 0 |
| 0.8638888888888889 | 0 |
| 0.8645833333333334 | 0 |
| 0.8652777777777777 | 0 |
| 0.8659722222222223 | 0 |
| 0.8666666666666667 | 0 |
| 0.8673611111111111 | 0 |
| 0.8680555555555555 | 0 |
| 0.86875 | 0 |
| 0.8694444444444445 | 0 |
| 0.8701388888888889 | 0 |
| 0.8708333333333332 | 0 |
| 0.8715277777777778 | 0 |
| 0.8722222222222222 | 0 |
| 0.8729166666666667 | 0 |
| 0.873611111111111 | 0 |
| 0.8743055555555556 | 0 |
| 0.875 | 0 |
| 0.8756944444444444 | 0 |
| 0.876388888888889 | 0 |
| 0.8770833333333333 | 0 |
| 0.8777777777777778 | 0 |
| 0.8784722222222222 | 0 |
| 0.8791666666666668 | 0 |
| 0.8798611111111111 | 0 |
| 0.8805555555555555 | 0 |
| 0.88125 | 0 |
| 0.8819444444444445 | 0 |
| 0.8826388888888889 | 0 |
| 0.8833333333333333 | 0 |
| 0.8840277777777777 | 0 |
| 0.8847222222222223 | 0 |
| 0.8854166666666666 | 0 |
| 0.8861111111111111 | 0 |
| 0.8868055555555556 | 0 |
| 0.8875000000000001 | 0 |
| 0.8881944444444444 | 0 |
| 0.8888888888888888 | 0 |
| 0.8895833333333334 | 0 |
| 0.8902777777777778 | 0 |
| 0.8909722222222222 | 0 |
| 0.8916666666666666 | 0 |
| 0.8923611111111112 | 0 |
| 0.8930555555555556 | 0 |
| 0.8937499999999999 | 0 |
| 0.8944444444444444 | 0 |
| 0.8951388888888889 | 0 |
| 0.8958333333333334 | 0 |
| 0.8965277777777777 | 0 |
| 0.8972222222222223 | 0 |
| 0.8979166666666667 | 0 |
| 0.8986111111111111 | 0 |
| 0.8993055555555555 | 0 |
| 0.9 | 0 |
| 0.9006944444444445 | 0 |
| 0.9013888888888889 | 0 |
| 0.9020833333333332 | 0 |
| 0.9027777777777778 | 0 |
| 0.9034722222222222 | 0 |
| 0.9041666666666667 | 0 |
| 0.904861111111111 | 0 |
| 0.9055555555555556 | 0 |
| 0.90625 | 0 |
| 0.9069444444444444 | 0 |
| 0.907638888888889 | 0 |
| 0.9083333333333333 | 0 |
| 0.9090277777777778 | 0 |
| 0.9097222222222222 | 0 |
| 0.9104166666666668 | 0 |
| 0.9111111111111111 | 0 |
| 0.9118055555555555 | 0 |
| 0.9125 | 0 |
| 0.9131944444444445 | 0 |
| 0.9138888888888889 | 0 |
| 0.9145833333333333 | 0 |
| 0.9152777777777777 | 0 |
| 0.9159722222222223 | 0 |
| 0.9166666666666666 | 0 |
| 0.9173611111111111 | 0 |
| 0.9180555555555556 | 0 |
| 0.9187500000000001 | 0 |
| 0.9194444444444444 | 0 |
| 0.9201388888888888 | 0 |
| 0.9208333333333334 | 0 |
| 0.9215277777777778 | 0 |
| 0.9222222222222222 | 0 |
| 0.9229166666666666 | 0 |
| 0.9236111111111112 | 0 |
| 0.9243055555555556 | 0 |
| 0.9249999999999999 | 0 |
| 0.9256944444444444 | 0 |
| 0.9263888888888889 | 0 |
| 0.9270833333333334 | 0 |
| 0.9277777777777777 | 0 |
| 0.9284722222222223 | 0 |
| 0.9291666666666667 | 0 |
| 0.9298611111111111 | 0 |
| 0.9305555555555555 | 0 |
| 0.93125 | 0 |
| 0.9319444444444445 | 0 |
| 0.9326388888888889 | 0 |
| 0.9333333333333332 | 0 |
| 0.9340277777777778 | 0 |
| 0.9347222222222222 | 0 |
| 0.9354166666666667 | 0 |
| 0.936111111111111 | 0 |
| 0.9368055555555556 | 0 |
| 0.9375 | 0 |
| 0.9381944444444444 | 0 |
| 0.938888888888889 | 0 |
| 0.9395833333333333 | 0 |
| 0.9402777777777778 | 0 |
| 0.9409722222222222 | 0 |
| 0.9416666666666668 | 0 |
| 0.9423611111111111 | 0 |
| 0.9430555555555555 | 0 |
| 0.94375 | 0 |
| 0.9444444444444445 | 0 |
| 0.9451388888888889 | 0 |
| 0.9458333333333333 | 0 |
| 0.9465277777777777 | 0 |
| 0.9472222222222223 | 0 |
| 0.9479166666666666 | 0 |
| 0.9486111111111111 | 0 |
| 0.9493055555555556 | 0 |
| 0.9500000000000001 | 0 |
| 0.9506944444444444 | 0 |
| 0.9513888888888888 | 0 |
| 0.9520833333333334 | 0 |
| 0.9527777777777778 | 0 |
| 0.9534722222222222 | 0 |
| 0.9541666666666666 | 0 |
| 0.9548611111111112 | 0 |
| 0.9555555555555556 | 0 |
| 0.9562499999999999 | 0 |
| 0.9569444444444444 | 0 |
| 0.9576388888888889 | 0 |
| 0.9583333333333334 | 0 |
| 0.9590277777777777 | 0 |
| 0.9597222222222223 | 0 |
| 0.9604166666666667 | 0 |
| 0.9611111111111111 | 0 |
| 0.9618055555555555 | 0 |
| 0.9625 | 0 |
| 0.9631944444444445 | 0 |
| 0.9638888888888889 | 0 |
| 0.9645833333333332 | 0 |
| 0.9652777777777778 | 0 |
| 0.9659722222222222 | 0 |
| 0.9666666666666667 | 0 |
| 0.967361111111111 | 0 |
| 0.9680555555555556 | 0 |
| 0.96875 | 0 |
| 0.9694444444444444 | 0 |
| 0.970138888888889 | 0 |
| 0.9708333333333333 | 0 |
| 0.9715277777777778 | 0 |
| 0.9722222222222222 | 0 |
| 0.9729166666666668 | 0 |
| 0.9736111111111111 | 0 |
| 0.9743055555555555 | 0 |
| 0.975 | 0 |
| 0.9756944444444445 | 0 |
| 0.9763888888888889 | 0 |
| 0.9770833333333333 | 0 |
| 0.9777777777777777 | 0 |
| 0.9784722222222223 | 0 |
| 0.9791666666666666 | 0 |
| 0.9798611111111111 | 0 |
| 0.9805555555555556 | 0 |
| 0.9812500000000001 | 0 |
| 0.9819444444444444 | 0 |
| 0.9826388888888888 | 0 |
| 0.9833333333333334 | 0 |
| 0.9840277777777778 | 0 |
| 0.9847222222222222 | 0 |
| 0.9854166666666666 | 0 |
| 0.9861111111111112 | 0 |
| 0.9868055555555556 | 0 |
| 0.9874999999999999 | 0 |
| 0.9881944444444444 | 0 |
| 0.9888888888888889 | 0 |
| 0.9895833333333334 | 0 |
| 0.9902777777777777 | 0 |
| 0.9909722222222223 | 0 |
| 0.9916666666666667 | 0 |
| 0.9923611111111111 | 0 |
| 0.9930555555555555 | 0 |
| 0.99375 | 0 |
| 0.9944444444444445 | 0 |
| 0.9951388888888889 | 0 |
| 0.9958333333333332 | 0 |
| 0.9965277777777778 | 0 |
| 0.9972222222222222 | 0 |
| 0.9979166666666667 | 0 |
| 0.998611111111111 | 0 |
| 0.9993055555555556 | 0 |